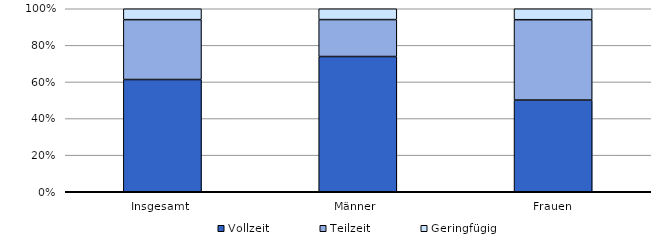
| Category | Vollzeit | Teilzeit | Geringfügig |
|---|---|---|---|
| Insgesamt  | 61.325 | 32.723 | 5.952 |
| Männer  | 73.9 | 20.179 | 5.921 |
| Frauen | 50.102 | 43.918 | 5.98 |